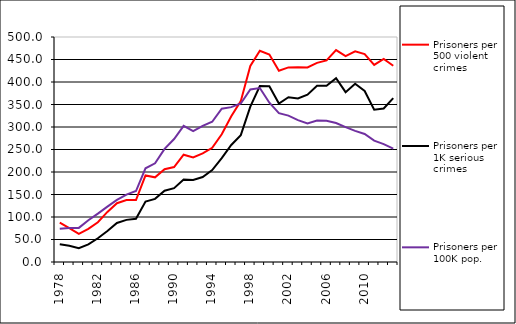
| Category | Prisoners per 500 violent crimes | Prisoners per 1K serious crimes | Prisoners per 100K pop. |
|---|---|---|---|
| 1978.0 | 87.376 | 39.368 | 74 |
| 1979.0 | 75.367 | 35.928 | 75.546 |
| 1980.0 | 62.696 | 30.526 | 75.781 |
| 1981.0 | 73.499 | 39.217 | 92.704 |
| 1982.0 | 88.434 | 52.707 | 107.421 |
| 1983.0 | 111.273 | 68.754 | 123.085 |
| 1984.0 | 130.651 | 86.698 | 137.898 |
| 1985.0 | 137.654 | 93.604 | 149.894 |
| 1986.0 | 137.771 | 95.993 | 157.743 |
| 1987.0 | 192.365 | 134.307 | 208.147 |
| 1988.0 | 188.207 | 140.352 | 219.378 |
| 1989.0 | 206.311 | 158.48 | 251.28 |
| 1990.0 | 211.039 | 164.184 | 273.318 |
| 1991.0 | 238.372 | 183.349 | 302.616 |
| 1992.0 | 232.362 | 182.314 | 290.833 |
| 1993.0 | 241.253 | 188.943 | 302.462 |
| 1994.0 | 253.708 | 204.215 | 311.64 |
| 1995.0 | 283.996 | 230.968 | 340.667 |
| 1996.0 | 323.724 | 260.031 | 344.141 |
| 1997.0 | 357.435 | 282.011 | 352.179 |
| 1998.0 | 435.624 | 345.103 | 383.5 |
| 1999.0 | 469.484 | 391.033 | 386.73 |
| 2000.0 | 461.081 | 390.753 | 353.967 |
| 2001.0 | 425.183 | 352.189 | 330.65 |
| 2002.0 | 432.392 | 366.259 | 325.25 |
| 2003.0 | 432.641 | 363.547 | 315.259 |
| 2004.0 | 432.359 | 371.764 | 308.077 |
| 2005.0 | 442.43 | 391.408 | 314.357 |
| 2006.0 | 448.044 | 391.467 | 313.724 |
| 2007.0 | 470.897 | 408.344 | 308.856 |
| 2008.0 | 457.709 | 377.482 | 299.571 |
| 2009.0 | 468.078 | 396.235 | 291.488 |
| 2010.0 | 462.151 | 380.121 | 284.432 |
| 2011.0 | 438.077 | 338.354 | 269.775 |
| 2012.0 | 451.374 | 341.218 | 261.904 |
| 2013.0 | 435.995 | 364.297 | 251.944 |